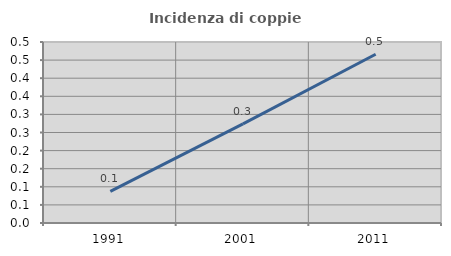
| Category | Incidenza di coppie miste |
|---|---|
| 1991.0 | 0.087 |
| 2001.0 | 0.274 |
| 2011.0 | 0.466 |